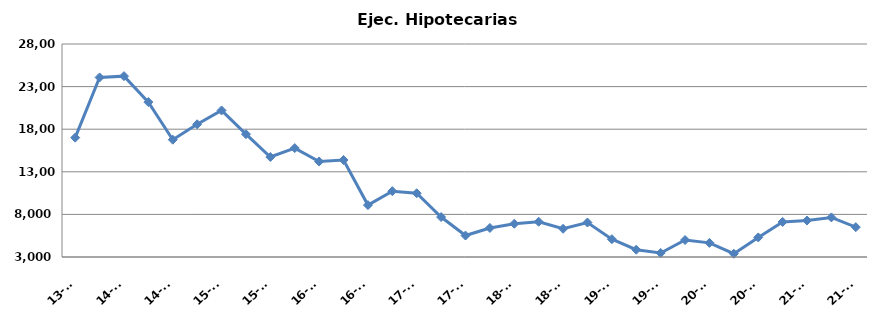
| Category | Ej. Hipotecarias |
|---|---|
| 13-T3 | 17009 |
| 13-T4 | 24076 |
| 14-T1 | 24226 |
| 14-T2 | 21178 |
| 14-T3 | 16767 |
| 14-T4 | 18578 |
| 15-T1 | 20201 |
| 15-T2 | 17414 |
| 15-T3 | 14735 |
| 15-T4 | 15785 |
| 16-T1 | 14205 |
| 16-T2 | 14385 |
| 16-T3 | 9094 |
| 16-T4 | 10726 |
| 17-T1 | 10478 |
| 17-T2 | 7689 |
| 17-T3 | 5518 |
| 17-T4 | 6409 |
| 18-T1 | 6903 |
| 18-T2 | 7137 |
| 18-T3 | 6315 |
| 18-T4 | 7049 |
| 19-T1 | 5092 |
| 19-T2 | 3857 |
| 19-T3 | 3470 |
| 19-T4 | 4992 |
| 20-T1 | 4658 |
| 20-T2 | 3387 |
| 20-T3 | 5299 |
| 20-T4 | 7116 |
| 21-T1 | 7280 |
| 21-T2 | 7646 |
| 21-T3 | 6504 |